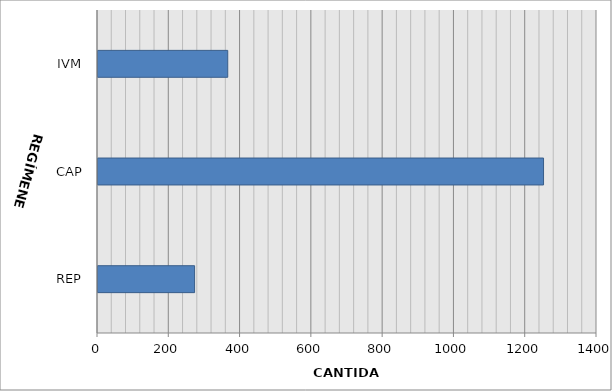
| Category | Series 0 |
|---|---|
| REP | 271 |
| CAP | 1250 |
| IVM | 364 |